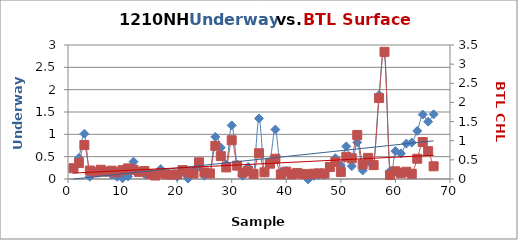
| Category |  FL |
|---|---|
| 0 | 0.218 |
| 1 | 0.473 |
| 2 | 1.014 |
| 3 | 0.051 |
| 4 | 0.167 |
| 5 | 0.156 |
| 6 | 0.154 |
| 7 | 0.095 |
| 8 | 0.049 |
| 9 | 0.017 |
| 10 | 0.057 |
| 11 | 0.387 |
| 12 | 0.167 |
| 13 | 0.113 |
| 14 | -0.078 |
| 15 | -0.04 |
| 16 | 0.222 |
| 17 | -0.039 |
| 18 | -0.047 |
| 19 | 0.053 |
| 20 | 0.161 |
| 21 | 0.008 |
| 22 | 0.18 |
| 23 | 0.277 |
| 24 | 0.073 |
| 25 | 0.128 |
| 26 | 0.943 |
| 27 | 0.701 |
| 28 | 0.324 |
| 29 | 1.2 |
| 30 | 0.325 |
| 31 | 0.074 |
| 32 | 0.27 |
| 33 | 0.101 |
| 34 | 1.356 |
| 35 | 0.144 |
| 36 | 0.38 |
| 37 | 1.107 |
| 38 | 0.15 |
| 39 | 0.181 |
| 40 | 0.103 |
| 41 | 0.146 |
| 42 | 0.126 |
| 43 | -0.009 |
| 44 | 0.069 |
| 45 | 0.095 |
| 46 | 0.09 |
| 47 | 0.258 |
| 48 | 0.465 |
| 49 | 0.299 |
| 50 | 0.73 |
| 51 | 0.288 |
| 52 | 0.821 |
| 53 | 0.192 |
| 54 | 0.394 |
| 55 | 0.324 |
| 56 | 1.88 |
| 57 | 2.823 |
| 58 | 0.175 |
| 59 | 0.625 |
| 60 | 0.572 |
| 61 | 0.792 |
| 62 | 0.816 |
| 63 | 1.075 |
| 64 | 1.443 |
| 65 | 1.284 |
| 66 | 1.448 |